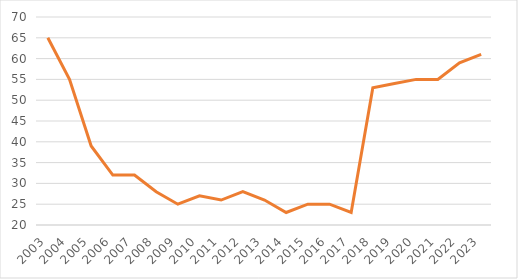
| Category | CZE number |
|---|---|
| 2003.0 | 65 |
| 2004.0 | 55 |
| 2005.0 | 39 |
| 2006.0 | 32 |
| 2007.0 | 32 |
| 2008.0 | 28 |
| 2009.0 | 25 |
| 2010.0 | 27 |
| 2011.0 | 26 |
| 2012.0 | 28 |
| 2013.0 | 26 |
| 2014.0 | 23 |
| 2015.0 | 25 |
| 2016.0 | 25 |
| 2017.0 | 23 |
| 2018.0 | 53 |
| 2019.0 | 54 |
| 2020.0 | 55 |
| 2021.0 | 55 |
| 2022.0 | 59 |
| 2023.0 | 61 |